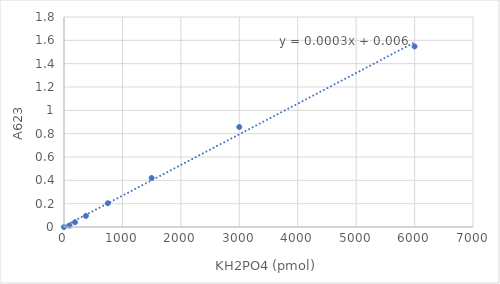
| Category | Series 0 |
|---|---|
| 0.0 | 0 |
| 93.75 | 0.012 |
| 187.5 | 0.041 |
| 375.0 | 0.095 |
| 750.0 | 0.204 |
| 1500.0 | 0.42 |
| 3000.0 | 0.857 |
| 6000.0 | 1.547 |